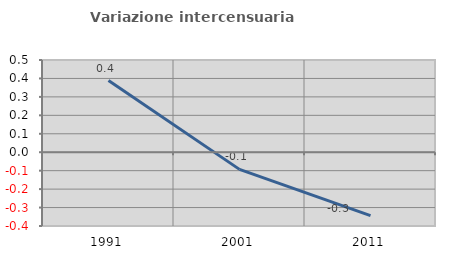
| Category | Variazione intercensuaria annua |
|---|---|
| 1991.0 | 0.389 |
| 2001.0 | -0.093 |
| 2011.0 | -0.344 |